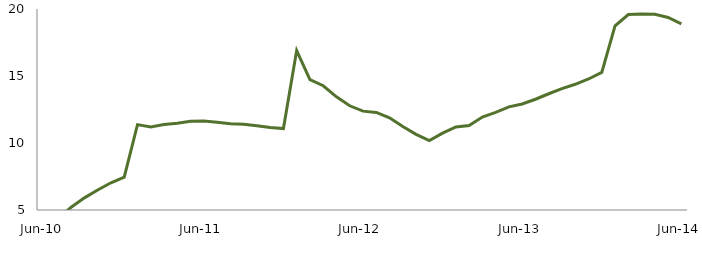
| Category | Series 0 |
|---|---|
| Jun-10 | 3.302 |
|  | 4.36 |
|  | 5.202 |
|  | 5.906 |
|  | 6.496 |
|  | 7.032 |
|  | 7.452 |
|  | 11.37 |
|  | 11.198 |
|  | 11.376 |
|  | 11.48 |
|  | 11.628 |
| Jun-11 | 11.638 |
|  | 11.549 |
|  | 11.441 |
|  | 11.392 |
|  | 11.289 |
|  | 11.163 |
|  | 11.08 |
|  | 16.903 |
|  | 14.732 |
|  | 14.273 |
|  | 13.449 |
|  | 12.778 |
| Jun-12 | 12.379 |
|  | 12.281 |
|  | 11.878 |
|  | 11.225 |
|  | 10.643 |
|  | 10.175 |
|  | 10.732 |
|  | 11.199 |
|  | 11.297 |
|  | 11.935 |
|  | 12.289 |
|  | 12.699 |
| Jun-13 | 12.911 |
|  | 13.266 |
|  | 13.675 |
|  | 14.064 |
|  | 14.382 |
|  | 14.778 |
|  | 15.268 |
|  | 18.737 |
|  | 19.583 |
|  | 19.624 |
|  | 19.606 |
|  | 19.369 |
| Jun-14 | 18.883 |